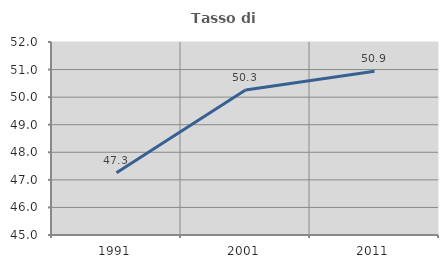
| Category | Tasso di occupazione   |
|---|---|
| 1991.0 | 47.256 |
| 2001.0 | 50.259 |
| 2011.0 | 50.94 |